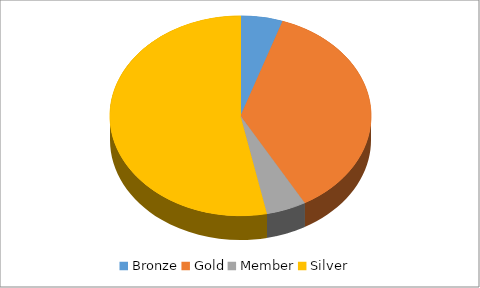
| Category | Sum of Donation |
|---|---|
| Bronze | 61510 |
| Gold | 432934 |
| Member | 58320 |
| Silver | 629462 |